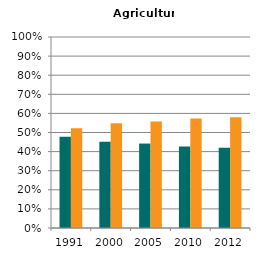
| Category | Male | Female |
|---|---|---|
| 1991.0 | 0.478 | 0.522 |
| 2000.0 | 0.452 | 0.548 |
| 2005.0 | 0.442 | 0.558 |
| 2010.0 | 0.426 | 0.574 |
| 2012.0 | 0.421 | 0.579 |